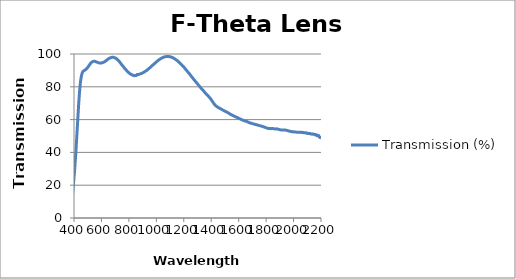
| Category | Transmission (%) |
|---|---|
| 2200.0 | 48.909 |
| 2195.0 | 49.002 |
| 2190.0 | 49.203 |
| 2185.0 | 49.96 |
| 2180.0 | 50.497 |
| 2175.0 | 50.126 |
| 2170.0 | 50.164 |
| 2165.0 | 50.717 |
| 2160.0 | 50.951 |
| 2155.0 | 50.739 |
| 2150.0 | 51.008 |
| 2145.0 | 51.164 |
| 2140.0 | 51.171 |
| 2135.0 | 51.096 |
| 2130.0 | 51.288 |
| 2125.0 | 51.267 |
| 2120.0 | 51.538 |
| 2115.0 | 51.442 |
| 2110.0 | 51.536 |
| 2105.0 | 51.499 |
| 2100.0 | 51.825 |
| 2095.0 | 51.615 |
| 2090.0 | 51.925 |
| 2085.0 | 52.061 |
| 2080.0 | 51.95 |
| 2075.0 | 51.927 |
| 2070.0 | 52.164 |
| 2065.0 | 52.057 |
| 2060.0 | 52.299 |
| 2055.0 | 52.189 |
| 2050.0 | 52.23 |
| 2045.0 | 52.247 |
| 2040.0 | 52.208 |
| 2035.0 | 52.239 |
| 2030.0 | 52.208 |
| 2025.0 | 52.271 |
| 2020.0 | 52.357 |
| 2015.0 | 52.375 |
| 2010.0 | 52.396 |
| 2005.0 | 52.437 |
| 2000.0 | 52.537 |
| 1995.0 | 52.577 |
| 1990.0 | 52.561 |
| 1985.0 | 52.666 |
| 1980.0 | 52.752 |
| 1975.0 | 52.844 |
| 1970.0 | 53.002 |
| 1965.0 | 53.1 |
| 1960.0 | 53.124 |
| 1955.0 | 53.339 |
| 1950.0 | 53.462 |
| 1945.0 | 53.527 |
| 1940.0 | 53.6 |
| 1935.0 | 53.67 |
| 1930.0 | 53.6 |
| 1925.0 | 53.712 |
| 1920.0 | 53.726 |
| 1915.0 | 53.709 |
| 1910.0 | 53.675 |
| 1905.0 | 53.741 |
| 1900.0 | 53.793 |
| 1895.0 | 53.989 |
| 1890.0 | 54.07 |
| 1885.0 | 54.219 |
| 1880.0 | 54.356 |
| 1875.0 | 54.344 |
| 1870.0 | 54.284 |
| 1865.0 | 54.283 |
| 1860.0 | 54.389 |
| 1855.0 | 54.411 |
| 1850.0 | 54.554 |
| 1845.0 | 54.515 |
| 1840.0 | 54.498 |
| 1835.0 | 54.493 |
| 1830.0 | 54.525 |
| 1825.0 | 54.502 |
| 1820.0 | 54.591 |
| 1815.0 | 54.623 |
| 1810.0 | 54.752 |
| 1805.0 | 54.849 |
| 1800.0 | 55.016 |
| 1795.0 | 55.158 |
| 1790.0 | 55.34 |
| 1785.0 | 55.519 |
| 1780.0 | 55.627 |
| 1775.0 | 55.792 |
| 1770.0 | 55.914 |
| 1765.0 | 56.022 |
| 1760.0 | 56.148 |
| 1755.0 | 56.28 |
| 1750.0 | 56.395 |
| 1745.0 | 56.506 |
| 1740.0 | 56.633 |
| 1735.0 | 56.753 |
| 1730.0 | 56.848 |
| 1725.0 | 56.983 |
| 1720.0 | 57.07 |
| 1715.0 | 57.196 |
| 1710.0 | 57.358 |
| 1705.0 | 57.42 |
| 1700.0 | 57.557 |
| 1695.0 | 57.707 |
| 1690.0 | 57.81 |
| 1685.0 | 57.923 |
| 1680.0 | 58.08 |
| 1675.0 | 58.222 |
| 1670.0 | 58.394 |
| 1665.0 | 58.599 |
| 1660.0 | 58.846 |
| 1655.0 | 58.949 |
| 1650.0 | 59.069 |
| 1645.0 | 59.2 |
| 1640.0 | 59.345 |
| 1635.0 | 59.494 |
| 1630.0 | 59.676 |
| 1625.0 | 59.868 |
| 1620.0 | 60.057 |
| 1615.0 | 60.259 |
| 1610.0 | 60.448 |
| 1605.0 | 60.614 |
| 1600.0 | 60.802 |
| 1595.0 | 61.007 |
| 1590.0 | 61.222 |
| 1585.0 | 61.428 |
| 1580.0 | 61.584 |
| 1575.0 | 61.756 |
| 1570.0 | 61.962 |
| 1565.0 | 62.165 |
| 1560.0 | 62.388 |
| 1555.0 | 62.628 |
| 1550.0 | 62.84 |
| 1545.0 | 63.04 |
| 1540.0 | 63.255 |
| 1535.0 | 63.495 |
| 1530.0 | 63.762 |
| 1525.0 | 64.035 |
| 1520.0 | 64.281 |
| 1515.0 | 64.52 |
| 1510.0 | 64.739 |
| 1505.0 | 64.946 |
| 1500.0 | 65.135 |
| 1495.0 | 65.363 |
| 1490.0 | 65.602 |
| 1485.0 | 65.81 |
| 1480.0 | 66.038 |
| 1475.0 | 66.289 |
| 1470.0 | 66.531 |
| 1465.0 | 66.754 |
| 1460.0 | 66.96 |
| 1455.0 | 67.171 |
| 1450.0 | 67.439 |
| 1445.0 | 67.722 |
| 1440.0 | 68.004 |
| 1435.0 | 68.34 |
| 1430.0 | 68.73 |
| 1425.0 | 69.182 |
| 1420.0 | 69.703 |
| 1415.0 | 70.294 |
| 1410.0 | 70.915 |
| 1405.0 | 71.559 |
| 1400.0 | 72.178 |
| 1395.0 | 72.748 |
| 1390.0 | 73.27 |
| 1385.0 | 73.728 |
| 1380.0 | 74.183 |
| 1375.0 | 74.66 |
| 1370.0 | 75.099 |
| 1365.0 | 75.515 |
| 1360.0 | 75.944 |
| 1355.0 | 76.416 |
| 1350.0 | 76.927 |
| 1345.0 | 77.423 |
| 1340.0 | 77.911 |
| 1335.0 | 78.353 |
| 1330.0 | 78.787 |
| 1325.0 | 79.261 |
| 1320.0 | 79.747 |
| 1315.0 | 80.266 |
| 1310.0 | 80.751 |
| 1305.0 | 81.248 |
| 1300.0 | 81.789 |
| 1295.0 | 82.284 |
| 1290.0 | 82.79 |
| 1285.0 | 83.314 |
| 1280.0 | 83.822 |
| 1275.0 | 84.318 |
| 1270.0 | 84.823 |
| 1265.0 | 85.366 |
| 1260.0 | 85.903 |
| 1255.0 | 86.427 |
| 1250.0 | 86.957 |
| 1245.0 | 87.498 |
| 1240.0 | 88.037 |
| 1235.0 | 88.531 |
| 1230.0 | 89.008 |
| 1225.0 | 89.527 |
| 1220.0 | 90.039 |
| 1215.0 | 90.53 |
| 1210.0 | 91.058 |
| 1205.0 | 91.567 |
| 1200.0 | 92.034 |
| 1195.0 | 92.496 |
| 1190.0 | 92.948 |
| 1185.0 | 93.381 |
| 1180.0 | 93.806 |
| 1175.0 | 94.2 |
| 1170.0 | 94.632 |
| 1165.0 | 95.043 |
| 1160.0 | 95.406 |
| 1155.0 | 95.778 |
| 1150.0 | 96.132 |
| 1145.0 | 96.417 |
| 1140.0 | 96.718 |
| 1135.0 | 96.999 |
| 1130.0 | 97.258 |
| 1125.0 | 97.505 |
| 1120.0 | 97.735 |
| 1115.0 | 97.915 |
| 1110.0 | 98.089 |
| 1105.0 | 98.205 |
| 1100.0 | 98.306 |
| 1095.0 | 98.395 |
| 1090.0 | 98.47 |
| 1085.0 | 98.468 |
| 1080.0 | 98.477 |
| 1075.0 | 98.457 |
| 1070.0 | 98.392 |
| 1065.0 | 98.343 |
| 1060.0 | 98.262 |
| 1055.0 | 98.102 |
| 1050.0 | 97.952 |
| 1045.0 | 97.761 |
| 1040.0 | 97.547 |
| 1035.0 | 97.304 |
| 1030.0 | 97.079 |
| 1025.0 | 96.787 |
| 1020.0 | 96.479 |
| 1015.0 | 96.184 |
| 1010.0 | 95.853 |
| 1005.0 | 95.517 |
| 1000.0 | 95.146 |
| 995.0 | 94.743 |
| 990.0 | 94.388 |
| 985.0 | 94.032 |
| 980.0 | 93.654 |
| 975.0 | 93.298 |
| 970.0 | 92.937 |
| 965.0 | 92.561 |
| 960.0 | 92.185 |
| 955.0 | 91.789 |
| 950.0 | 91.433 |
| 945.0 | 91.082 |
| 940.0 | 90.72 |
| 935.0 | 90.308 |
| 930.0 | 90.016 |
| 925.0 | 89.754 |
| 920.0 | 89.451 |
| 915.0 | 89.23 |
| 910.0 | 88.938 |
| 905.0 | 88.704 |
| 900.0 | 88.488 |
| 895.0 | 88.2 |
| 890.0 | 88.089 |
| 885.0 | 87.945 |
| 880.0 | 87.829 |
| 875.0 | 87.623 |
| 870.0 | 87.528 |
| 865.0 | 87.544 |
| 860.0 | 87.529 |
| 855.0 | 86.941 |
| 850.0 | 86.912 |
| 845.0 | 86.868 |
| 840.0 | 86.799 |
| 835.0 | 86.856 |
| 830.0 | 87.07 |
| 825.0 | 87.158 |
| 820.0 | 87.472 |
| 815.0 | 87.63 |
| 810.0 | 87.888 |
| 805.0 | 88.152 |
| 800.0 | 88.571 |
| 795.0 | 88.89 |
| 790.0 | 89.311 |
| 785.0 | 89.755 |
| 780.0 | 90.254 |
| 775.0 | 90.772 |
| 770.0 | 91.144 |
| 765.0 | 91.691 |
| 760.0 | 92.253 |
| 755.0 | 92.738 |
| 750.0 | 93.279 |
| 745.0 | 93.788 |
| 740.0 | 94.351 |
| 735.0 | 94.937 |
| 730.0 | 95.382 |
| 725.0 | 95.874 |
| 720.0 | 96.341 |
| 715.0 | 96.662 |
| 710.0 | 97.038 |
| 705.0 | 97.435 |
| 700.0 | 97.579 |
| 695.0 | 97.744 |
| 690.0 | 97.92 |
| 685.0 | 98.024 |
| 680.0 | 98.031 |
| 675.0 | 97.941 |
| 670.0 | 97.79 |
| 665.0 | 97.686 |
| 660.0 | 97.468 |
| 655.0 | 97.292 |
| 650.0 | 96.955 |
| 645.0 | 96.703 |
| 640.0 | 96.307 |
| 635.0 | 96.023 |
| 630.0 | 95.76 |
| 625.0 | 95.382 |
| 620.0 | 95.106 |
| 615.0 | 94.972 |
| 610.0 | 94.793 |
| 605.0 | 94.643 |
| 600.0 | 94.488 |
| 595.0 | 94.466 |
| 590.0 | 94.516 |
| 585.0 | 94.528 |
| 580.0 | 94.616 |
| 575.0 | 94.766 |
| 570.0 | 94.954 |
| 565.0 | 95.128 |
| 560.0 | 95.254 |
| 555.0 | 95.461 |
| 550.0 | 95.547 |
| 545.0 | 95.602 |
| 540.0 | 95.489 |
| 535.0 | 95.28 |
| 530.0 | 95.014 |
| 525.0 | 94.687 |
| 520.0 | 94.216 |
| 515.0 | 93.611 |
| 510.0 | 93.026 |
| 505.0 | 92.471 |
| 500.0 | 91.858 |
| 495.0 | 91.325 |
| 490.0 | 90.923 |
| 485.0 | 90.491 |
| 480.0 | 90.199 |
| 475.0 | 89.949 |
| 470.0 | 89.682 |
| 465.0 | 89.32 |
| 460.0 | 88.459 |
| 455.0 | 86.935 |
| 450.0 | 84.675 |
| 445.0 | 81.167 |
| 440.0 | 76.383 |
| 435.0 | 70.58 |
| 430.0 | 63.743 |
| 425.0 | 56.541 |
| 420.0 | 49.198 |
| 415.0 | 42.218 |
| 410.0 | 35.738 |
| 405.0 | 29.907 |
| 400.0 | 24.547 |
| 395.0 | 19.705 |
| 390.0 | 15.123 |
| 385.0 | 10.765 |
| 380.0 | 6.677 |
| 375.0 | 3.638 |
| 370.0 | 2.268 |
| 365.0 | 2.014 |
| 360.0 | 2 |
| 355.0 | 1.988 |
| 350.0 | 1.983 |
| 345.0 | 1.978 |
| 340.0 | 1.975 |
| 335.0 | 1.972 |
| 330.0 | 1.966 |
| 325.0 | 1.974 |
| 320.0 | 1.975 |
| 315.0 | 1.967 |
| 310.0 | 1.974 |
| 305.0 | 1.986 |
| 300.0 | 2.01 |
| 295.0 | 2.033 |
| 290.0 | 2.011 |
| 285.0 | 2.003 |
| 280.0 | 1.993 |
| 275.0 | 1.98 |
| 270.0 | 1.981 |
| 265.0 | 1.982 |
| 260.0 | 2.016 |
| 255.0 | 2.033 |
| 250.0 | 2.231 |
| 245.0 | 2.212 |
| 240.0 | 2.225 |
| 235.0 | 2.028 |
| 230.0 | 1.847 |
| 225.0 | 1.726 |
| 220.0 | 1.701 |
| 215.0 | 1.916 |
| 210.0 | 1.928 |
| 205.0 | 2.943 |
| 200.0 | 8.343 |